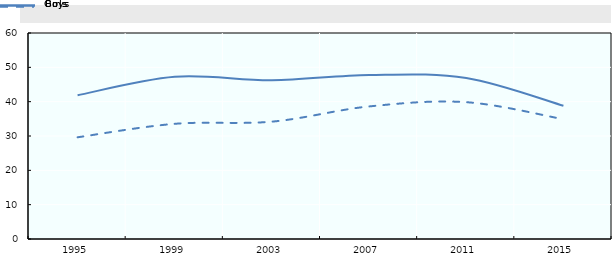
| Category | Boys | Girls |
|---|---|---|
| 1995.0 | 41.875 | 29.625 |
| 1999.0 | 47.25 | 33.55 |
| 2003.0 | 46.227 | 34.182 |
| 2007.0 | 47.778 | 38.611 |
| 2011.0 | 46.9 | 39.85 |
| 2015.0 | 38.814 | 34.887 |